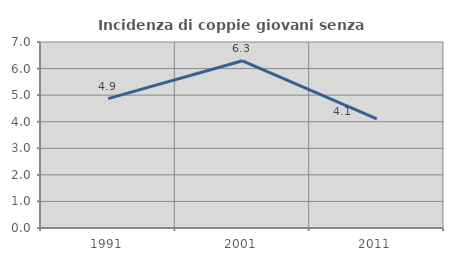
| Category | Incidenza di coppie giovani senza figli |
|---|---|
| 1991.0 | 4.868 |
| 2001.0 | 6.293 |
| 2011.0 | 4.103 |